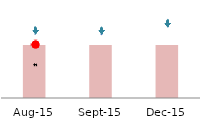
| Category | Series 1 |
|---|---|
| 2015-08-01 | 1220.997 |
| 2015-09-01 | 1220.997 |
| 2015-12-01 | 1220.997 |